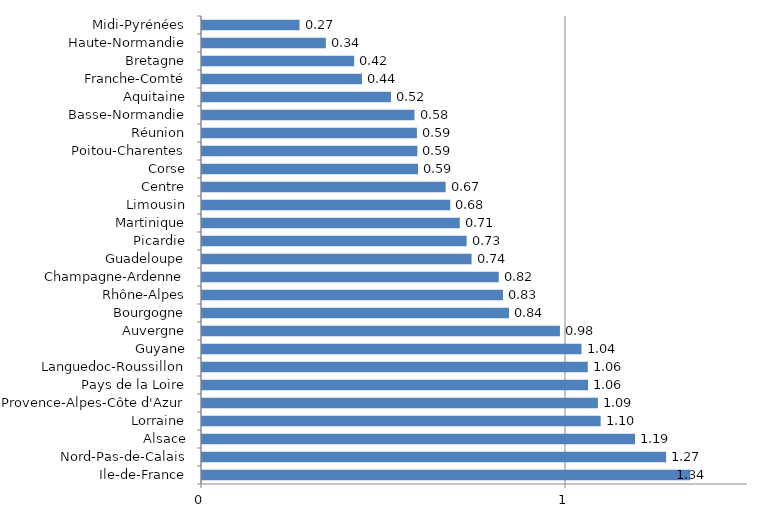
| Category | Series 0 |
|---|---|
| Ile-de-France | 1.341 |
| Nord-Pas-de-Calais | 1.275 |
| Alsace | 1.19 |
| Lorraine | 1.095 |
| Provence-Alpes-Côte d'Azur | 1.088 |
| Pays de la Loire | 1.061 |
| Languedoc-Roussillon | 1.06 |
| Guyane | 1.043 |
| Auvergne | 0.983 |
| Bourgogne | 0.844 |
| Rhône-Alpes | 0.827 |
| Champagne-Ardenne | 0.815 |
| Guadeloupe | 0.741 |
| Picardie | 0.727 |
| Martinique | 0.708 |
| Limousin | 0.682 |
| Centre | 0.669 |
| Corse | 0.594 |
| Poitou-Charentes | 0.592 |
| Réunion | 0.591 |
| Basse-Normandie | 0.584 |
| Aquitaine | 0.519 |
| Franche-Comté | 0.439 |
| Bretagne | 0.418 |
| Haute-Normandie | 0.34 |
| Midi-Pyrénées | 0.268 |